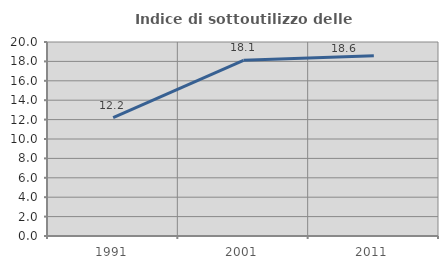
| Category | Indice di sottoutilizzo delle abitazioni  |
|---|---|
| 1991.0 | 12.208 |
| 2001.0 | 18.118 |
| 2011.0 | 18.59 |